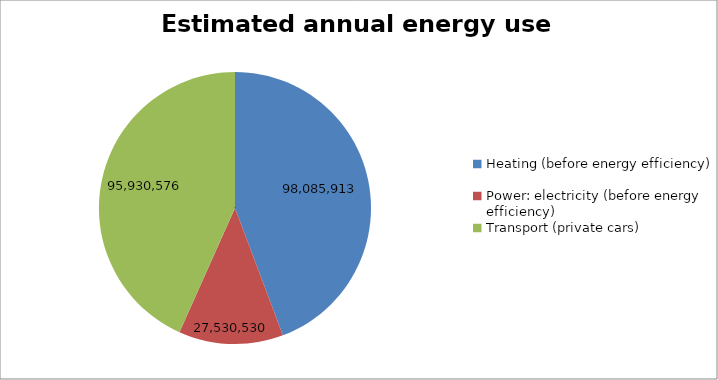
| Category | Estimated annual energy use (kWh/yr) |
|---|---|
| Heating (before energy efficiency) | 98085913.043 |
| Power: electricity (before energy efficiency) | 27530530.435 |
| Transport (private cars) | 95930576.015 |